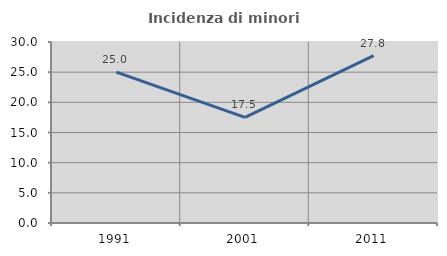
| Category | Incidenza di minori stranieri |
|---|---|
| 1991.0 | 25 |
| 2001.0 | 17.5 |
| 2011.0 | 27.755 |